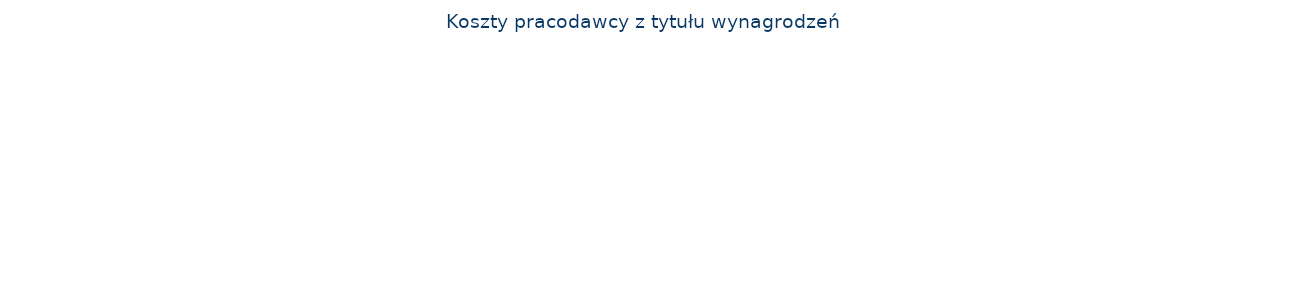
| Category | Series 0 |
|---|---|
| wynagrodzenie netto | 0 |
| PPK | 0 |
| zaliczka na PIT | 0 |
| zdrowotne | 0 |
| ub. chorobowe | 0 |
| ub. rentowe | 0 |
| ub. emerytalne | 0 |
| ub. wypadkowe | 0 |
| FP i FGŚP | 0 |